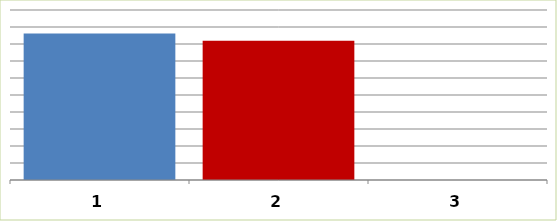
| Category | Series 0 |
|---|---|
| 0 | 861554 |
| 1 | 818400 |
| 2 | 0 |